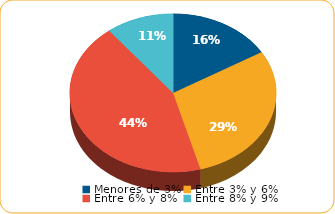
| Category | Series 0 |
|---|---|
| Menores de 3% | 2069.1 |
| Entre 3% y 6% | 3696.4 |
| Entre 6% y 8% | 5507.2 |
| Entre 8% y 9% | 1337.8 |